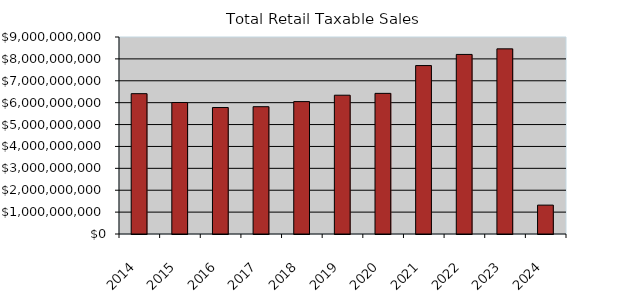
| Category | Series 0 |
|---|---|
| 2014.0 | 6411543250 |
| 2015.0 | 6006656784 |
| 2016.0 | 5778293947 |
| 2017.0 | 5815651079 |
| 2018.0 | 6048768442 |
| 2019.0 | 6340622737 |
| 2020.0 | 6425064749 |
| 2021.0 | 7694821723 |
| 2022.0 | 8203716329.5 |
| 2023.0 | 8458541337 |
| 2024.0 | 1319471574 |